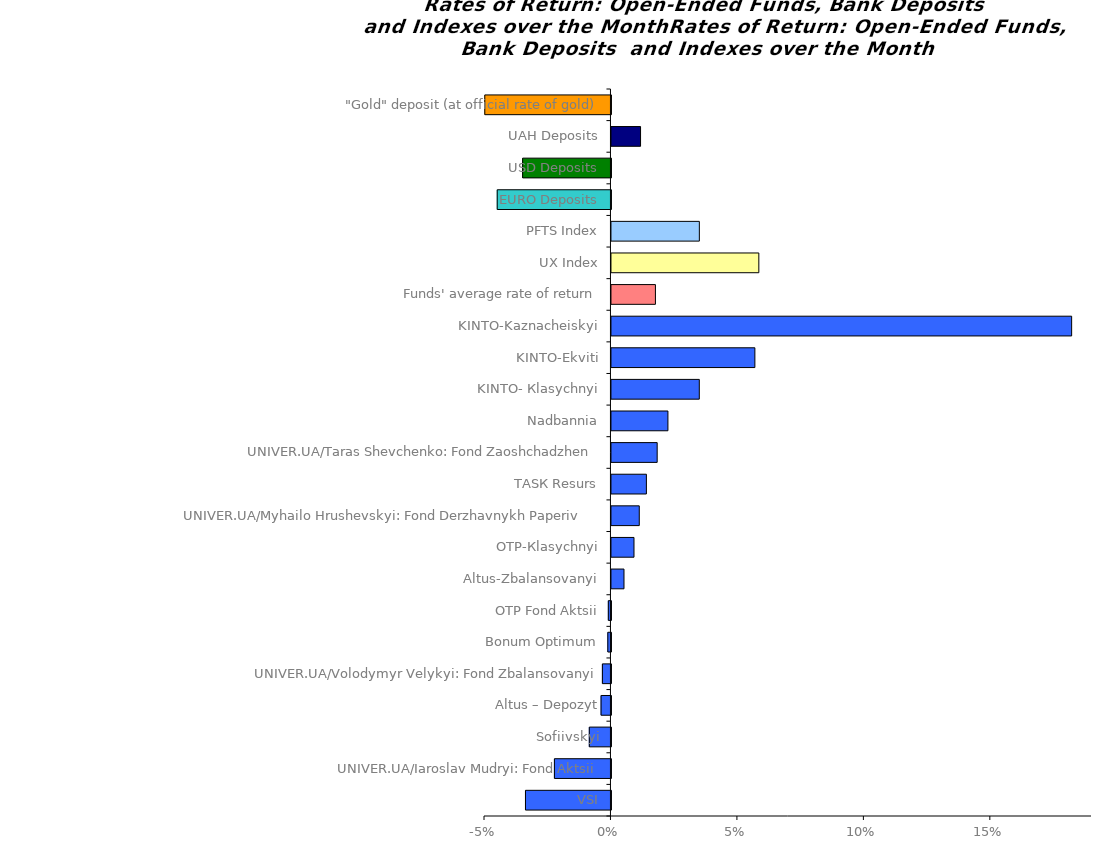
| Category | Series 0 |
|---|---|
| VSI | -0.034 |
| UNIVER.UA/Iaroslav Mudryi: Fond Aktsii | -0.022 |
| Sofiivskyi | -0.009 |
| Altus – Depozyt | -0.004 |
| UNIVER.UA/Volodymyr Velykyi: Fond Zbalansovanyi | -0.003 |
| Bonum Optimum | -0.001 |
| ОТP Fond Aktsii | -0.001 |
| Аltus-Zbalansovanyi | 0.005 |
| OTP-Кlasychnyi | 0.009 |
| UNIVER.UA/Myhailo Hrushevskyi: Fond Derzhavnykh Paperiv    | 0.011 |
| ТАSК Resurs | 0.014 |
| UNIVER.UA/Taras Shevchenko: Fond Zaoshchadzhen | 0.018 |
| Nadbannia | 0.022 |
| KINTO- Кlasychnyi | 0.035 |
| KINTO-Ekviti | 0.057 |
| KINTO-Kaznacheiskyi | 0.182 |
| Funds' average rate of return | 0.017 |
| UX Index | 0.058 |
| PFTS Index | 0.035 |
| EURO Deposits | -0.045 |
| USD Deposits | -0.035 |
| UAH Deposits | 0.012 |
| "Gold" deposit (at official rate of gold) | -0.05 |